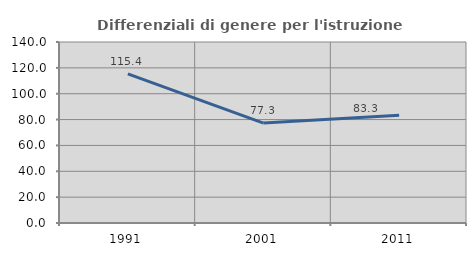
| Category | Differenziali di genere per l'istruzione superiore |
|---|---|
| 1991.0 | 115.35 |
| 2001.0 | 77.268 |
| 2011.0 | 83.265 |